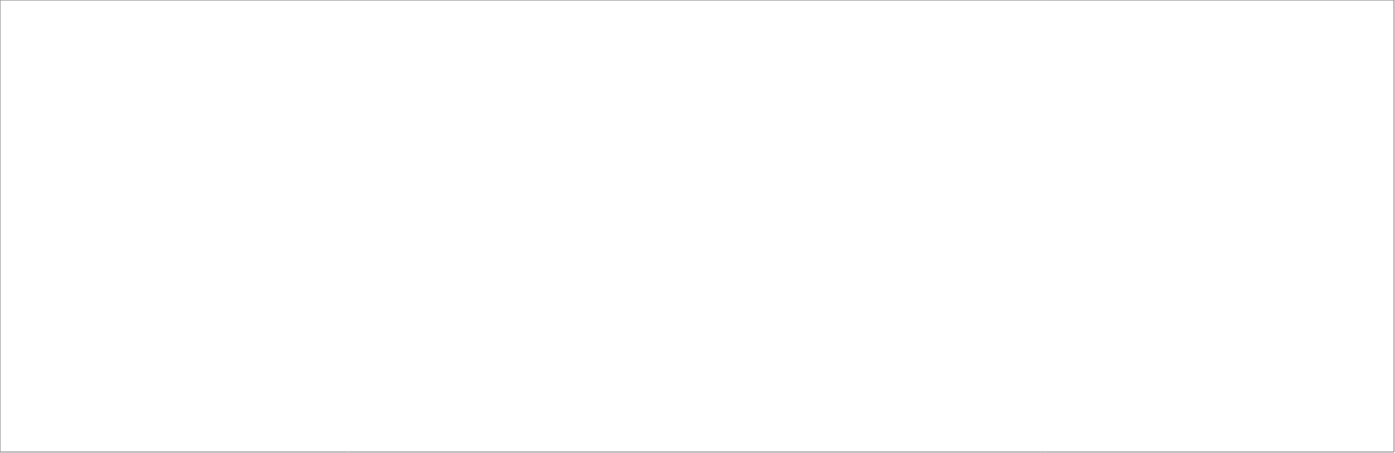
| Category | Intermediación financiera | Seguros | Actividades auxiliares de la intermediación financiera |
|---|---|---|---|
| 2018_I | 3871.635 | 570.048 | 501.887 |
| 2018_II | 3965.341 | 322.826 | 418.207 |
| 2018_III | 4086.206 | 350.011 | 341.211 |
| 2018_IV | 4242.437 | 459.123 | 379.574 |
| 2019_I | 4321.81 | 563.434 | 443.557 |
| 2019_II | 4513.555 | 376.368 | 350.634 |
| 2019_III | 0 | 0 | 0 |
| 2019_IV | 0 | 0 | 0 |